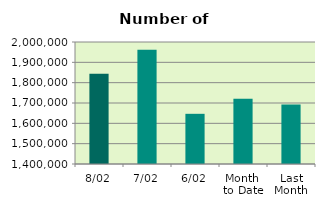
| Category | Series 0 |
|---|---|
| 8/02 | 1843668 |
| 7/02 | 1962130 |
| 6/02 | 1646826 |
| Month 
to Date | 1721206 |
| Last
Month | 1692009 |